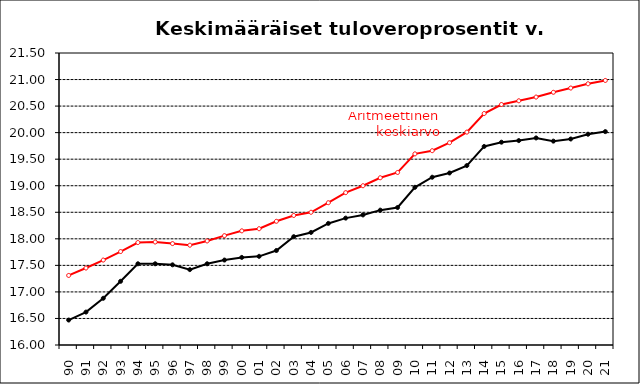
| Category | Series 2 | Series 3 |
|---|---|---|
| 90 | 16.47 | 17.31 |
| 91 | 16.62 | 17.45 |
| 92 | 16.88 | 17.6 |
| 93 | 17.2 | 17.76 |
| 94 | 17.53 | 17.93 |
| 95 | 17.53 | 17.94 |
| 96 | 17.51 | 17.91 |
| 97 | 17.42 | 17.88 |
| 98 | 17.53 | 17.96 |
| 99 | 17.6 | 18.06 |
| 00 | 17.65 | 18.15 |
| 01 | 17.67 | 18.19 |
| 02 | 17.78 | 18.33 |
| 03 | 18.04 | 18.44 |
| 04 | 18.12 | 18.5 |
| 05 | 18.29 | 18.68 |
| 06 | 18.39 | 18.87 |
| 07 | 18.45 | 19 |
| 08 | 18.54 | 19.15 |
| 09 | 18.59 | 19.25 |
| 10 | 18.97 | 19.6 |
| 11 | 19.16 | 19.66 |
| 12 | 19.24 | 19.81 |
| 13 | 19.38 | 20.01 |
| 14 | 19.74 | 20.36 |
| 15 | 19.82 | 20.53 |
| 16 | 19.85 | 20.6 |
| 17 | 19.9 | 20.67 |
| 18 | 19.84 | 20.76 |
| 19 | 19.88 | 20.84 |
| 20 | 19.97 | 20.92 |
| 21 | 20.019 | 20.983 |